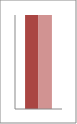
| Category | Series 1 | Series 2 |
|---|---|---|
| Point 1 | 1 | 1 |